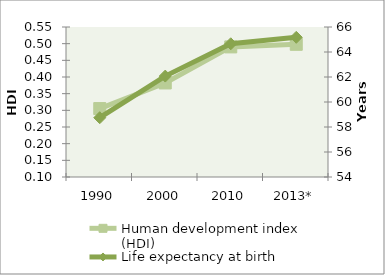
| Category | Human development index (HDI) |
|---|---|
| 1990 | 0.305 |
| 2000 | 0.382 |
| 2010 | 0.49 |
| 2013* | 0.498 |